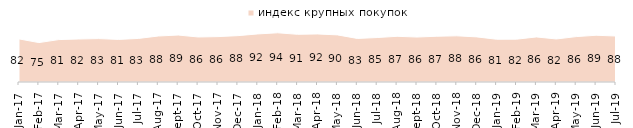
| Category | индекс крупных покупок |
|---|---|
| 2017-01-01 | 82.1 |
| 2017-02-01 | 75.05 |
| 2017-03-01 | 80.8 |
| 2017-04-01 | 81.9 |
| 2017-05-01 | 82.65 |
| 2017-06-01 | 81.15 |
| 2017-07-01 | 82.95 |
| 2017-08-01 | 87.6 |
| 2017-09-01 | 89.45 |
| 2017-10-01 | 85.75 |
| 2017-11-01 | 86.45 |
| 2017-12-01 | 88.3 |
| 2018-01-01 | 91.55 |
| 2018-02-01 | 93.75 |
| 2018-03-01 | 90.85 |
| 2018-04-01 | 91.5 |
| 2018-05-01 | 89.75 |
| 2018-06-01 | 82.95 |
| 2018-07-01 | 84.7 |
| 2018-08-01 | 87.05 |
| 2018-09-01 | 85.65 |
| 2018-10-01 | 87.15 |
| 2018-11-01 | 87.974 |
| 2018-12-01 | 85.95 |
| 2019-01-01 | 81.45 |
| 2019-02-01 | 81.55 |
| 2019-03-01 | 85.828 |
| 2019-04-01 | 81.98 |
| 2019-05-01 | 86.429 |
| 2019-06-01 | 89.027 |
| 2019-07-01 | 87.574 |